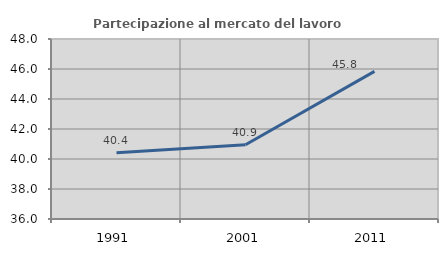
| Category | Partecipazione al mercato del lavoro  femminile |
|---|---|
| 1991.0 | 40.417 |
| 2001.0 | 40.946 |
| 2011.0 | 45.84 |